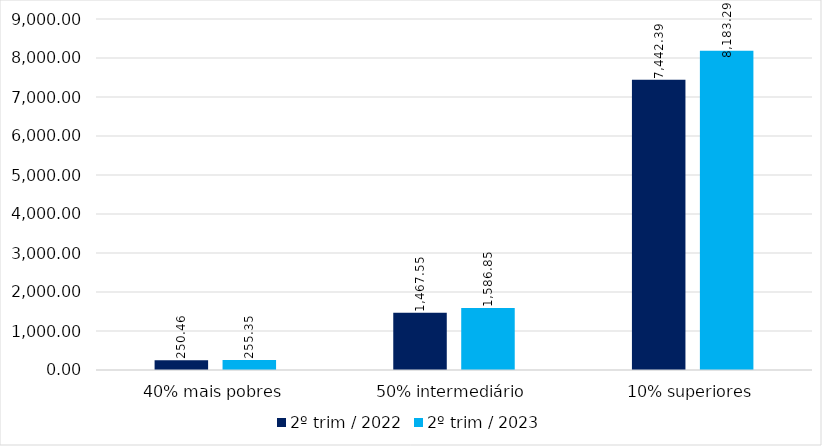
| Category | 2º trim / 2022 | 2º trim / 2023 |
|---|---|---|
| 40% mais pobres | 250.457 | 255.35 |
| 50% intermediário | 1467.553 | 1586.845 |
| 10% superiores | 7442.389 | 8183.294 |